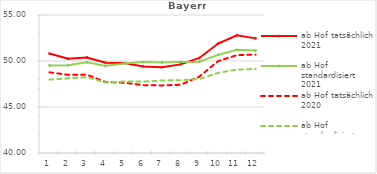
| Category | ab Hof tatsächlich 2021 | ab Hof standardisiert 2021 | ab Hof tatsächlich 2020 | ab Hof standardisiert 2020 |
|---|---|---|---|---|
| 0 | 50.814 | 49.518 | 48.769 | 47.981 |
| 1 | 50.256 | 49.536 | 48.497 | 48.113 |
| 2 | 50.388 | 49.855 | 48.519 | 48.252 |
| 3 | 49.82 | 49.471 | 47.706 | 47.663 |
| 4 | 49.781 | 49.733 | 47.637 | 47.771 |
| 5 | 49.406 | 49.886 | 47.375 | 47.759 |
| 6 | 49.32 | 49.849 | 47.346 | 47.879 |
| 7 | 49.633 | 49.905 | 47.419 | 47.919 |
| 8 | 50.33 | 49.917 | 48.304 | 48.041 |
| 9 | 51.901 | 50.67 | 49.988 | 48.714 |
| 10 | 52.797 | 51.216 | 50.636 | 49.068 |
| 11 | 52.458 | 51.149 | 50.693 | 49.141 |